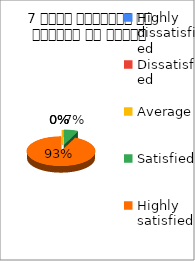
| Category | 7 विषय अवधारणा पर शिक्षक का ज्ञान  |
|---|---|
| Highly dissatisfied | 0 |
| Dissatisfied | 0 |
| Average | 0 |
| Satisfied | 1 |
| Highly satisfied | 14 |